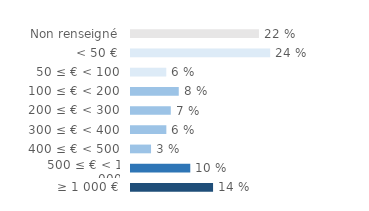
| Category | Series 0 |
|---|---|
| Non renseigné | 0.218 |
| < 50 € | 0.237 |
| 50 ≤ € < 100 | 0.06 |
| 100 ≤ € < 200 | 0.081 |
| 200 ≤ € < 300 | 0.068 |
| 300 ≤ € < 400 | 0.06 |
| 400 ≤ € < 500 | 0.034 |
| 500 ≤ € < 1 000 | 0.101 |
| ≥ 1 000 € | 0.14 |